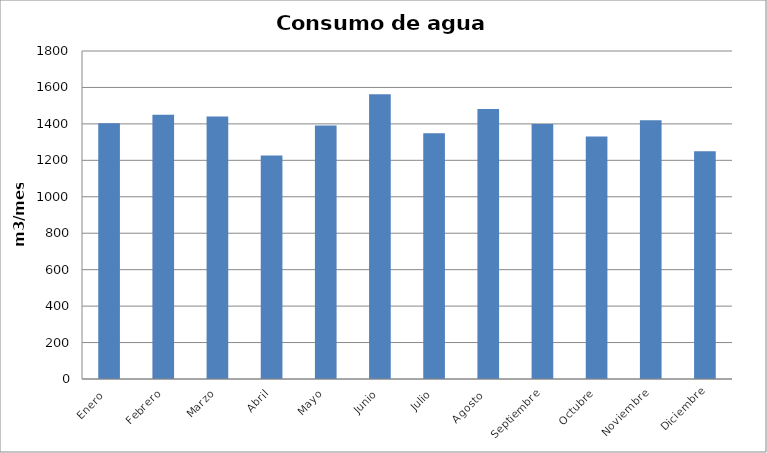
| Category | Series 0 |
|---|---|
| Enero  | 1404 |
| Febrero | 1450 |
| Marzo | 1441 |
| Abril | 1227 |
| Mayo | 1391 |
| Junio | 1563 |
| Julio | 1348 |
| Agosto  | 1482 |
| Septiembre | 1400 |
| Octubre | 1331 |
| Noviembre | 1420 |
| Diciembre | 1250 |